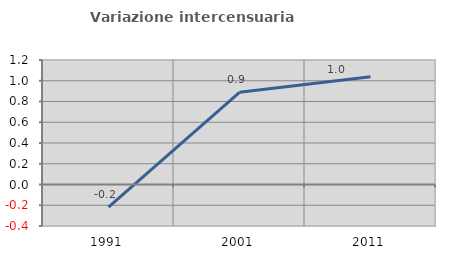
| Category | Variazione intercensuaria annua |
|---|---|
| 1991.0 | -0.218 |
| 2001.0 | 0.889 |
| 2011.0 | 1.039 |